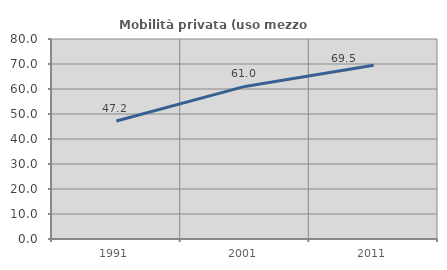
| Category | Mobilità privata (uso mezzo privato) |
|---|---|
| 1991.0 | 47.206 |
| 2001.0 | 61.034 |
| 2011.0 | 69.466 |